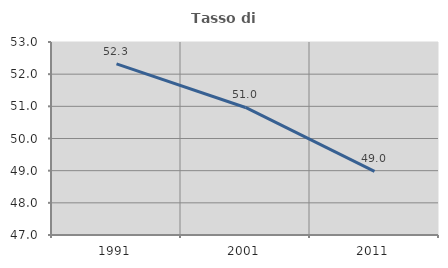
| Category | Tasso di occupazione   |
|---|---|
| 1991.0 | 52.319 |
| 2001.0 | 50.965 |
| 2011.0 | 48.979 |